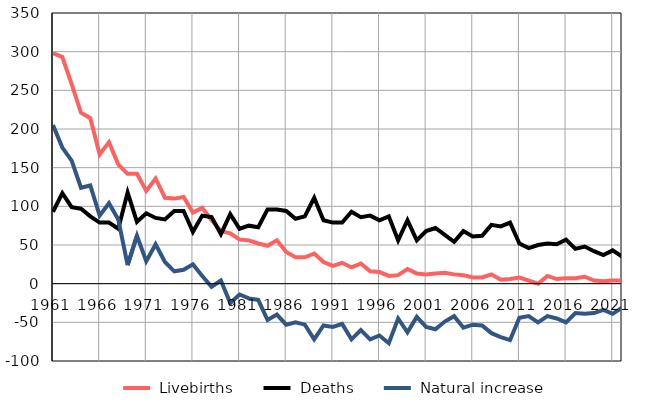
| Category |  Livebirths |  Deaths |  Natural increase |
|---|---|---|---|
| 1961.0 | 298 | 93 | 205 |
| 1962.0 | 293 | 117 | 176 |
| 1963.0 | 258 | 99 | 159 |
| 1964.0 | 221 | 97 | 124 |
| 1965.0 | 214 | 87 | 127 |
| 1966.0 | 167 | 79 | 88 |
| 1967.0 | 183 | 79 | 104 |
| 1968.0 | 154 | 71 | 83 |
| 1969.0 | 142 | 118 | 24 |
| 1970.0 | 142 | 80 | 62 |
| 1971.0 | 120 | 91 | 29 |
| 1972.0 | 136 | 85 | 51 |
| 1973.0 | 111 | 83 | 28 |
| 1974.0 | 110 | 94 | 16 |
| 1975.0 | 112 | 94 | 18 |
| 1976.0 | 92 | 67 | 25 |
| 1977.0 | 98 | 88 | 10 |
| 1978.0 | 82 | 86 | -4 |
| 1979.0 | 68 | 64 | 4 |
| 1980.0 | 65 | 90 | -25 |
| 1981.0 | 57 | 71 | -14 |
| 1982.0 | 56 | 75 | -19 |
| 1983.0 | 52 | 73 | -21 |
| 1984.0 | 49 | 96 | -47 |
| 1985.0 | 56 | 96 | -40 |
| 1986.0 | 41 | 94 | -53 |
| 1987.0 | 34 | 84 | -50 |
| 1988.0 | 34 | 87 | -53 |
| 1989.0 | 39 | 111 | -72 |
| 1990.0 | 28 | 82 | -54 |
| 1991.0 | 23 | 79 | -56 |
| 1992.0 | 27 | 79 | -52 |
| 1993.0 | 21 | 93 | -72 |
| 1994.0 | 26 | 86 | -60 |
| 1995.0 | 16 | 88 | -72 |
| 1996.0 | 15 | 82 | -67 |
| 1997.0 | 10 | 87 | -77 |
| 1998.0 | 11 | 56 | -45 |
| 1999.0 | 19 | 82 | -63 |
| 2000.0 | 13 | 56 | -43 |
| 2001.0 | 12 | 68 | -56 |
| 2002.0 | 13 | 72 | -59 |
| 2003.0 | 14 | 63 | -49 |
| 2004.0 | 12 | 54 | -42 |
| 2005.0 | 11 | 68 | -57 |
| 2006.0 | 8 | 61 | -53 |
| 2007.0 | 8 | 62 | -54 |
| 2008.0 | 12 | 76 | -64 |
| 2009.0 | 5 | 74 | -69 |
| 2010.0 | 6 | 79 | -73 |
| 2011.0 | 8 | 52 | -44 |
| 2012.0 | 4 | 46 | -42 |
| 2013.0 | 0 | 50 | -50 |
| 2014.0 | 10 | 52 | -42 |
| 2015.0 | 6 | 51 | -45 |
| 2016.0 | 7 | 57 | -50 |
| 2017.0 | 7 | 45 | -38 |
| 2018.0 | 9 | 48 | -39 |
| 2019.0 | 4 | 42 | -38 |
| 2020.0 | 3 | 37 | -34 |
| 2021.0 | 4 | 43 | -39 |
| 2022.0 | 4 | 35 | -31 |